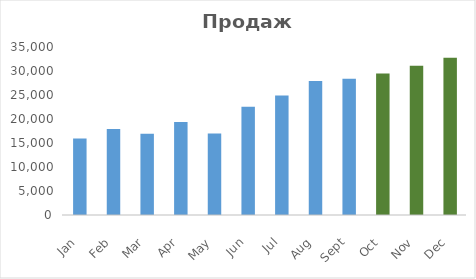
| Category | Продажи |
|---|---|
| 2016-01-01 | 15932 |
| 2016-02-01 | 17933 |
| 2016-03-01 | 16930 |
| 2016-04-01 | 19387 |
| 2016-05-01 | 16981 |
| 2016-06-01 | 22553 |
| 2016-07-01 | 24902 |
| 2016-08-01 | 27918 |
| 2016-09-01 | 28396 |
| 2016-10-01 | 29458.083 |
| 2016-11-01 | 31106.767 |
| 2016-12-01 | 32755.45 |